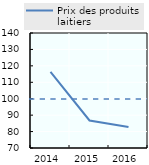
| Category | Prix des produits laitiers |
|---|---|
| 2014.0 | 116.291 |
| 2015.0 | 86.754 |
| 2016.0 | 82.738 |